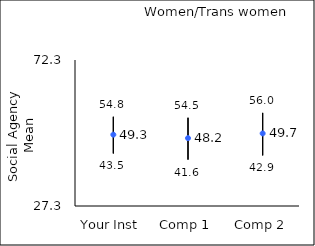
| Category | 25th percentile | 75th percentile | Mean |
|---|---|---|---|
| Your Inst | 43.5 | 54.8 | 49.29 |
| Comp 1 | 41.6 | 54.5 | 48.22 |
| Comp 2 | 42.9 | 56 | 49.67 |